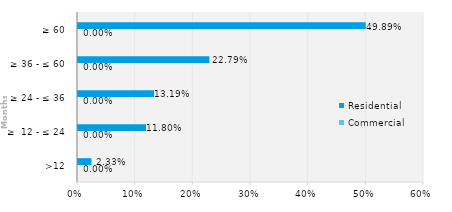
| Category | Commercial | Residential |
|---|---|---|
| >12 | 0 | 0.023 |
| ≥  12 - ≤ 24 | 0 | 0.118 |
| ≥ 24 - ≤ 36 | 0 | 0.132 |
| ≥ 36 - ≤ 60 | 0 | 0.228 |
| ≥ 60 | 0 | 0.499 |